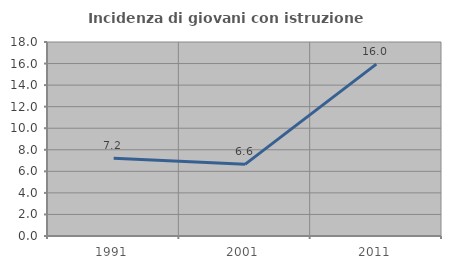
| Category | Incidenza di giovani con istruzione universitaria |
|---|---|
| 1991.0 | 7.209 |
| 2001.0 | 6.647 |
| 2011.0 | 15.951 |